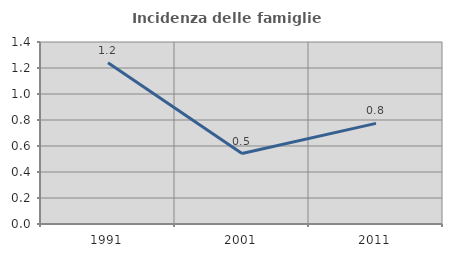
| Category | Incidenza delle famiglie numerose |
|---|---|
| 1991.0 | 1.24 |
| 2001.0 | 0.542 |
| 2011.0 | 0.774 |